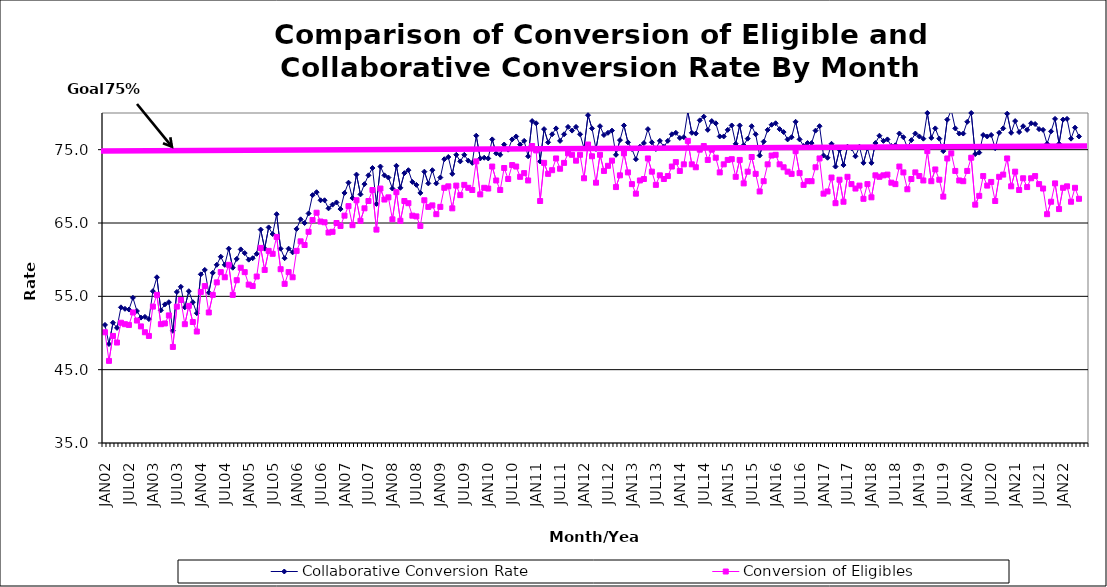
| Category | Collaborative Conversion Rate | Conversion of Eligibles |
|---|---|---|
| JAN02 | 51.1 | 50.1 |
| FEB02 | 48.5 | 46.2 |
| MAR02 | 51.4 | 49.6 |
| APR02 | 50.7 | 48.7 |
| MAY02 | 53.5 | 51.4 |
| JUN02 | 53.3 | 51.2 |
| JUL02 | 53.2 | 51.1 |
| AUG02 | 54.8 | 52.8 |
| SEP02 | 53 | 51.7 |
| OCT02 | 52.1 | 50.9 |
| NOV02 | 52.2 | 50.1 |
| DEC02 | 51.9 | 49.6 |
| JAN03 | 55.7 | 53.6 |
| FEB03 | 57.6 | 55.2 |
| MAR03 | 53.1 | 51.2 |
| APR03 | 53.9 | 51.3 |
| MAY03 | 54.2 | 52.4 |
| JUN03 | 50.3 | 48.1 |
| JUL03 | 55.6 | 53.6 |
| AUG03 | 56.3 | 54.5 |
| SEP03 | 53.5 | 51.2 |
| OCT03 | 55.7 | 53.7 |
| NOV03 | 54.2 | 51.5 |
| DEC03 | 52.7 | 50.2 |
| JAN04 | 58 | 55.6 |
| FEB04 | 58.6 | 56.4 |
| MAR04 | 55.5 | 52.8 |
| APR04 | 58.2 | 55.2 |
| MAY04 | 59.3 | 56.9 |
| JUN04 | 60.4 | 58.3 |
| JUL04 | 59.3 | 57.6 |
| AUG04 | 61.5 | 59.3 |
| SEP04 | 58.9 | 55.2 |
| OCT04 | 60.1 | 57.2 |
| NOV04 | 61.4 | 58.9 |
| DEC04 | 60.9 | 58.3 |
| JAN05 | 60 | 56.6 |
| FEB05 | 60.2 | 56.4 |
| MAR05 | 60.8 | 57.7 |
| APR05 | 64.1 | 61.6 |
| MAY05 | 61.5 | 58.6 |
| JUN05 | 64.4 | 61.2 |
| JUL05 | 63.5 | 60.8 |
| AUG05 | 66.2 | 63.1 |
| SEP05 | 61.5 | 58.7 |
| OCT05 | 60.2 | 56.7 |
| NOV05 | 61.5 | 58.3 |
| DEC05 | 61 | 57.6 |
| JAN06 | 64.2 | 61.2 |
| FEB06 | 65.5 | 62.5 |
| MAR06 | 65 | 62 |
| APR06 | 66.3 | 63.8 |
| MAY06 | 68.8 | 65.4 |
| JUN06 | 69.2 | 66.4 |
| JUL06 | 68.1 | 65.2 |
| AUG06 | 68.1 | 65.1 |
| SEP06 | 67 | 63.7 |
| OCT06 | 67.5 | 63.8 |
| NOV06 | 67.8 | 65 |
| DEC06 | 66.9 | 64.6 |
| JAN07 | 69.1 | 66 |
| FEB07 | 70.5 | 67.3 |
| MAR07 | 68.4 | 64.7 |
| APR07 | 71.6 | 68.1 |
| MAY07 | 68.9 | 65.3 |
| JUN07 | 70.3 | 67 |
| JUL07 | 71.5 | 68 |
| AUG07 | 72.5 | 69.5 |
| SEP07 | 67.6 | 64.1 |
| OCT07 | 72.7 | 69.7 |
| NOV07 | 71.5 | 68.2 |
| DEC07 | 71.2 | 68.5 |
| JAN08 | 69.7 | 65.5 |
| FEB08 | 72.8 | 69.2 |
| MAR08 | 69.8 | 65.3 |
| APR08 | 71.8 | 68 |
| MAY08 | 72.2 | 67.7 |
| JUN08 | 70.6 | 66 |
| JUL08 | 70.2 | 65.9 |
| AUG08 | 69.1 | 64.6 |
| SEP08 | 72 | 68.1 |
| OCT08 | 70.4 | 67.2 |
| NOV08 | 72.2 | 67.4 |
| DEC08 | 70.4 | 66.2 |
| JAN09 | 71.2 | 67.2 |
| FEB09 | 73.7 | 69.8 |
| MAR09 | 74 | 70 |
| APR09 | 71.7 | 67 |
| MAY09 | 74.3 | 70.1 |
| JUN09 | 73.4 | 68.8 |
| JUL09 | 74.3 | 70.2 |
| AUG09 | 73.5 | 69.8 |
| SEP09 | 73.2 | 69.5 |
| OCT09 | 76.9 | 73.4 |
| NOV09 | 73.8 | 68.9 |
| DEC09 | 73.9 | 69.8 |
| JAN10 | 73.8 | 69.7 |
| FEB10 | 76.4 | 72.7 |
| MAR10 | 74.5 | 70.8 |
| APR10 | 74.3 | 69.5 |
| MAY10 | 75.7 | 72.5 |
| JUN10 | 75 | 71 |
| JUL10 | 76.4 | 72.9 |
| AUG10 | 76.8 | 72.7 |
| SEP10 | 75.7 | 71.3 |
| OCT10 | 76.2 | 71.8 |
| NOV10 | 74.1 | 70.8 |
| DEC10 | 78.9 | 75.5 |
| JAN11 | 78.6 | 74.9 |
| FEB11 | 73.4 | 68 |
| MAR11 | 77.8 | 73.2 |
| APR11 | 76 | 71.7 |
| MAY11 | 77.1 | 72.2 |
| JUN11 | 77.9 | 73.8 |
| JUL11 | 76.2 | 72.4 |
| AUG11 | 77.1 | 73.2 |
| SEP11 | 78.1 | 74.5 |
| OCT11 | 77.6 | 74.3 |
| NOV11 | 78.1 | 73.5 |
| DEC11 | 77.1 | 74.3 |
| JAN12 | 75.2 | 71.1 |
| FEB12 | 79.7 | 75.7 |
| MAR12 | 77.9 | 74.1 |
| APR12 | 75.1 | 70.5 |
| MAY12 | 78.2 | 74.3 |
| JUN12 | 77 | 72.1 |
| JUL12 | 77.3 | 72.8 |
| AUG12 | 77.6 | 73.5 |
| SEP12 | 74.3 | 69.9 |
| OCT12 | 76.3 | 71.5 |
| NOV12 | 78.3 | 74.5 |
| DEC12 | 76 | 71.9 |
| JAN13 | 75.1 | 70.3 |
| FEB13 | 73.7 | 69 |
| MAR13 | 75.4 | 70.8 |
| APR13 | 75.9 | 71 |
| MAY13 | 77.8 | 73.8 |
| JUN13 | 76 | 72 |
| JUL13 | 75.1 | 70.2 |
| AUG13 | 76.2 | 71.5 |
| SEP13 | 75.4 | 71 |
| OCT13 | 76.2 | 71.4 |
| NOV13 | 77.1 | 72.7 |
| DEC13 | 77.3 | 73.3 |
| JAN14 | 76.6 | 72.1 |
| FEB14 | 76.7 | 73 |
| MAR14 | 80.2 | 76.2 |
| APR14 | 77.3 | 73 |
| MAY14 | 77.2 | 72.6 |
| JUN14 | 79 | 75 |
| JUL14 | 79.5 | 75.5 |
| AUG14 | 77.7 | 73.6 |
| SEP14 | 78.9 | 75 |
| OCT14 | 78.6 | 73.9 |
| NOV14 | 76.8 | 71.9 |
| DEC14 | 76.8 | 73 |
| JAN15 | 77.7 | 73.6 |
| FEB15 | 78.3 | 73.7 |
| MAR15 | 75.8 | 71.3 |
| APR15 | 78.3 | 73.6 |
| MAY15 | 75.6 | 70.4 |
| JUN15 | 76.5 | 72 |
| JUL15 | 78.2 | 74 |
| AUG15 | 77.1 | 71.7 |
| SEP15 | 74.2 | 69.3 |
| OCT15 | 76.1 | 70.7 |
| NOV15 | 77.7 | 73 |
| DEC15 | 78.4 | 74.2 |
| JAN16 | 78.6 | 74.3 |
| FEB16 | 77.8 | 73 |
| MAR16 | 77.4 | 72.6 |
| APR16 | 76.4 | 72 |
| MAY16 | 76.7 | 71.7 |
| JUN16 | 78.8 | 74.8 |
| JUL16 | 76.4 | 71.8 |
| AUG16 | 75.5 | 70.2 |
| SEP16 | 75.9 | 70.7 |
| OCT16 | 75.9 | 70.7 |
| NOV16 | 77.6 | 72.6 |
| DEC16 | 78.2 | 73.8 |
| JAN17 | 74.2 | 69 |
| FEB17 | 73.9 | 69.3 |
| MAR17 | 75.8 | 71.2 |
| APR17 | 72.7 | 67.7 |
| MAY17 | 75 | 70.9 |
| JUN17 | 72.9 | 67.9 |
| JUL17 | 75.4 | 71.3 |
| AUG17 | 75.2 | 70.3 |
| SEP17 | 74.1 | 69.7 |
| OCT17 | 75.4 | 70.1 |
| NOV17 | 73.2 | 68.3 |
| DEC17 | 75.2 | 70.3 |
| JAN18 | 73.2 | 68.5 |
| FEB18 | 75.9 | 71.5 |
| MAR18 | 76.9 | 71.3 |
| APR18 | 76.2 | 71.5 |
| MAY18 | 76.4 | 71.6 |
| JUN18 | 75.5 | 70.5 |
| JUL18 | 75.6 | 70.3 |
| AUG18 | 77.2 | 72.7 |
| SEP18 | 76.7 | 71.9 |
| OCT18 | 75.3 | 69.6 |
| NOV18 | 76.3 | 71 |
| DEC18 | 77.2 | 71.9 |
| JAN19 | 76.8 | 71.4 |
| FEB19 | 76.5 | 70.8 |
| MAR19 | 80 | 74.8 |
| APR19 | 76.6 | 70.7 |
| MAY19 | 77.9 | 72.3 |
| JUN19 | 76.5 | 70.9 |
| JUL19 | 74.8 | 68.6 |
| AUG19 | 79.1 | 73.8 |
| SEP19 | 80.4 | 74.5 |
| OCT19 | 77.9 | 72.1 |
| NOV19 | 77.2 | 70.8 |
| DEC19 | 77.2 | 70.7 |
| JAN20 | 78.8 | 72.1 |
| FEB20 | 80 | 73.9 |
| MAR20 | 74.4 | 67.5 |
| APR20 | 74.6 | 68.7 |
| MAY20 | 77 | 71.4 |
| JUN20 | 76.8 | 70.1 |
| JUL20 | 77 | 70.6 |
| AUG20 | 75.2 | 68 |
| SEP20 | 77.3 | 71.3 |
| OCT20 | 77.9 | 71.6 |
| NOV20 | 79.9 | 73.8 |
| DEC20 | 77.3 | 70 |
| JAN21 | 78.9 | 72 |
| FEB21 | 77.4 | 69.5 |
| MAR21 | 78.2 | 71.1 |
| APR21 | 77.7 | 69.9 |
| MAY21 | 78.6 | 71.1 |
| JUN21 | 78.5 | 71.4 |
| JUL21 | 77.8 | 70.3 |
| AUG21 | 77.7 | 69.7 |
| SEP21 | 75.8 | 66.2 |
| OCT21 | 77.5 | 67.9 |
| NOV21 | 79.2 | 70.4 |
| DEC21 | 75.8 | 66.9 |
| JAN22 | 79.1 | 69.8 |
| FEB22 | 79.2 | 70 |
| MAR22 | 76.5 | 67.9 |
| APR22 | 78 | 69.8 |
| MAY22 | 76.8 | 68.3 |